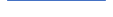
| Category | Series 0 |
|---|---|
| 0 | 41 |
| 1 | 21 |
| 2 | 36 |
| 3 | 37 |
| 4 | 38 |
| 5 | 38 |
| 6 | 29 |
| 7 | 28 |
| 8 | 40 |